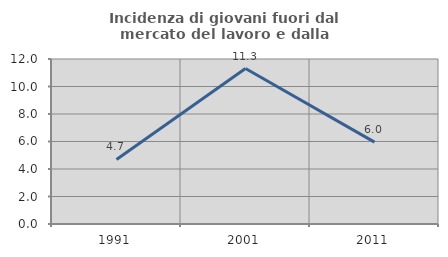
| Category | Incidenza di giovani fuori dal mercato del lavoro e dalla formazione  |
|---|---|
| 1991.0 | 4.698 |
| 2001.0 | 11.304 |
| 2011.0 | 5.952 |